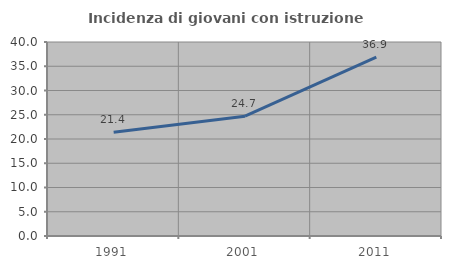
| Category | Incidenza di giovani con istruzione universitaria |
|---|---|
| 1991.0 | 21.388 |
| 2001.0 | 24.697 |
| 2011.0 | 36.889 |